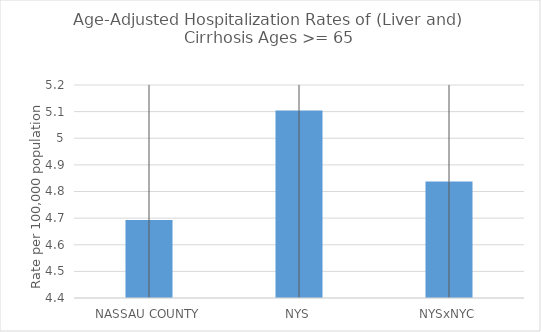
| Category | Age-Adjusted Hospitalization Rates of (Liver and) Cirrhosis Ages >= 65 |
|---|---|
| NASSAU COUNTY | 4.693 |
| NYS | 5.105 |
| NYSxNYC | 4.838 |